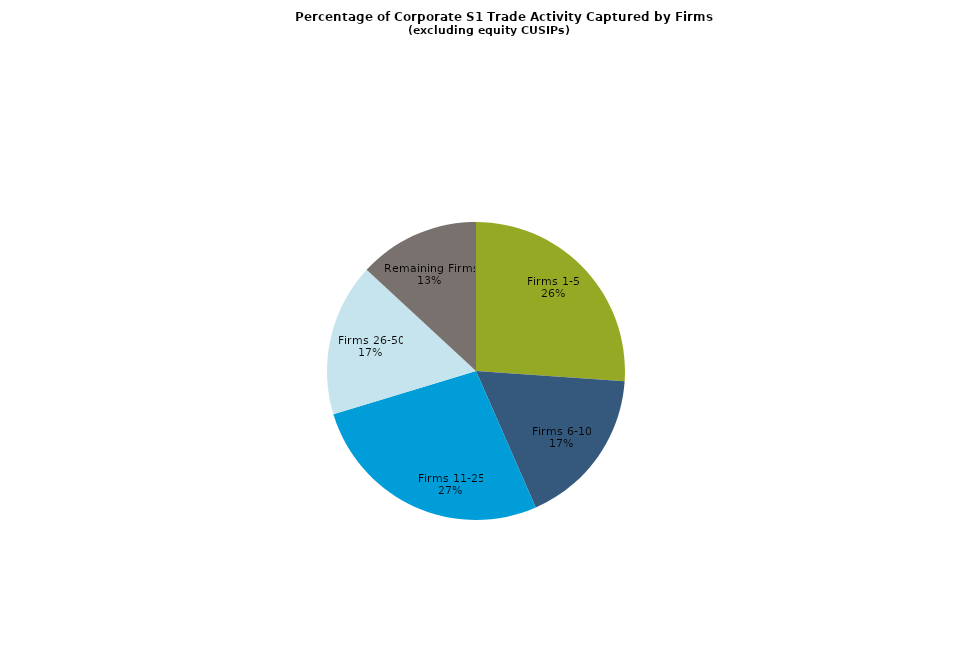
| Category | Series 0 |
|---|---|
| Firms 1-5 | 0.261 |
| Firms 6-10 | 0.173 |
| Firms 11-25 | 0.269 |
| Firms 26-50 | 0.166 |
| Remaining Firms | 0.131 |